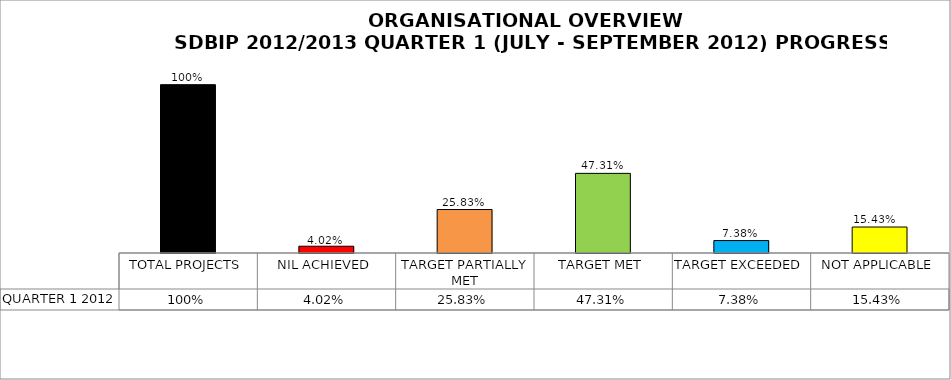
| Category | QUARTER 1 2012 |
|---|---|
| TOTAL PROJECTS | 1 |
| NIL ACHIEVED | 0.04 |
| TARGET PARTIALLY MET | 0.258 |
| TARGET MET | 0.473 |
| TARGET EXCEEDED | 0.074 |
| NOT APPLICABLE | 0.154 |